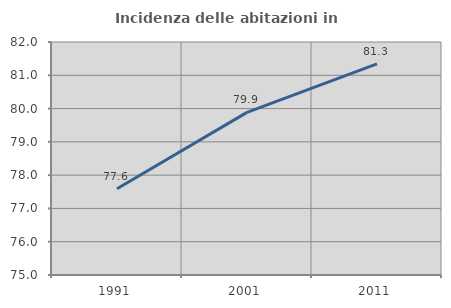
| Category | Incidenza delle abitazioni in proprietà  |
|---|---|
| 1991.0 | 77.59 |
| 2001.0 | 79.885 |
| 2011.0 | 81.342 |